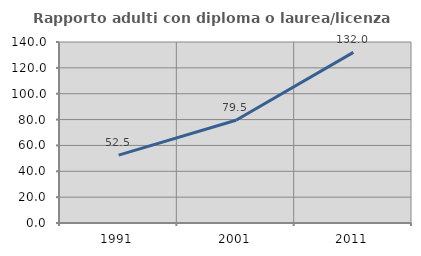
| Category | Rapporto adulti con diploma o laurea/licenza media  |
|---|---|
| 1991.0 | 52.522 |
| 2001.0 | 79.522 |
| 2011.0 | 131.961 |